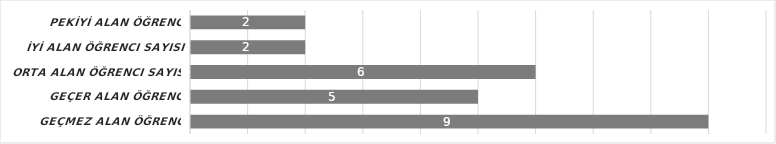
| Category | Series 6 |
|---|---|
| GEÇMEZ alan öğrenci sayısı | 9 |
| GEÇER alan öğrenci sayısı | 5 |
| ORTA alan öğrenci sayısı | 6 |
| İYİ alan öğrenci sayısı | 2 |
| PEKİYİ alan öğrenci sayısı | 2 |